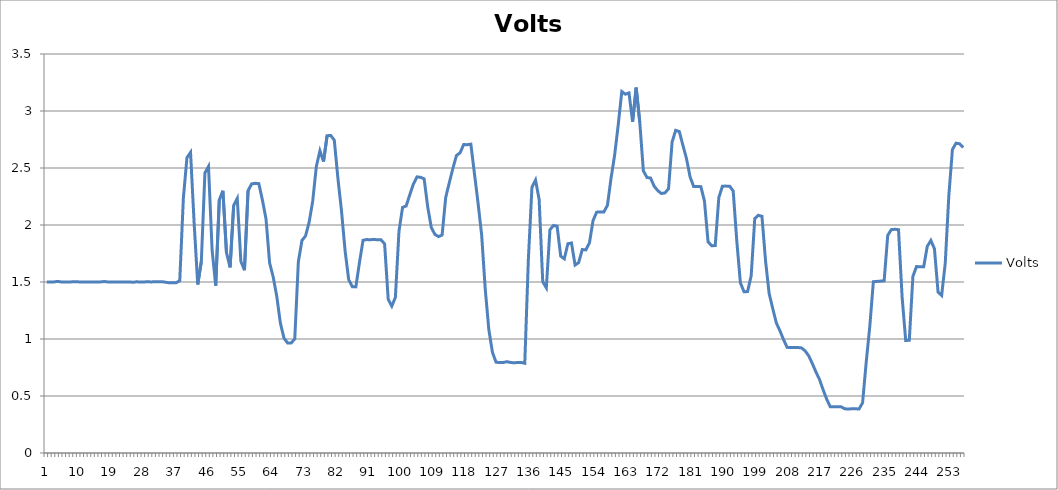
| Category | Volts |
|---|---|
| 0 | 1.501 |
| 1 | 1.5 |
| 2 | 1.501 |
| 3 | 1.505 |
| 4 | 1.501 |
| 5 | 1.5 |
| 6 | 1.501 |
| 7 | 1.501 |
| 8 | 1.502 |
| 9 | 1.501 |
| 10 | 1.5 |
| 11 | 1.501 |
| 12 | 1.501 |
| 13 | 1.5 |
| 14 | 1.501 |
| 15 | 1.501 |
| 16 | 1.504 |
| 17 | 1.501 |
| 18 | 1.5 |
| 19 | 1.501 |
| 20 | 1.5 |
| 21 | 1.501 |
| 22 | 1.501 |
| 23 | 1.501 |
| 24 | 1.498 |
| 25 | 1.502 |
| 26 | 1.5 |
| 27 | 1.501 |
| 28 | 1.502 |
| 29 | 1.501 |
| 30 | 1.502 |
| 31 | 1.503 |
| 32 | 1.503 |
| 33 | 1.498 |
| 34 | 1.493 |
| 35 | 1.494 |
| 36 | 1.493 |
| 37 | 1.512 |
| 38 | 2.235 |
| 39 | 2.591 |
| 40 | 2.637 |
| 41 | 2.016 |
| 42 | 1.478 |
| 43 | 1.68 |
| 44 | 2.456 |
| 45 | 2.514 |
| 46 | 1.778 |
| 47 | 1.469 |
| 48 | 2.22 |
| 49 | 2.301 |
| 50 | 1.757 |
| 51 | 1.628 |
| 52 | 2.171 |
| 53 | 2.233 |
| 54 | 1.682 |
| 55 | 1.603 |
| 56 | 2.3 |
| 57 | 2.36 |
| 58 | 2.365 |
| 59 | 2.363 |
| 60 | 2.218 |
| 61 | 2.054 |
| 62 | 1.667 |
| 63 | 1.544 |
| 64 | 1.373 |
| 65 | 1.139 |
| 66 | 1.008 |
| 67 | 0.965 |
| 68 | 0.965 |
| 69 | 1 |
| 70 | 1.678 |
| 71 | 1.864 |
| 72 | 1.905 |
| 73 | 2.024 |
| 74 | 2.211 |
| 75 | 2.513 |
| 76 | 2.651 |
| 77 | 2.556 |
| 78 | 2.783 |
| 79 | 2.786 |
| 80 | 2.744 |
| 81 | 2.411 |
| 82 | 2.125 |
| 83 | 1.775 |
| 84 | 1.521 |
| 85 | 1.459 |
| 86 | 1.457 |
| 87 | 1.67 |
| 88 | 1.866 |
| 89 | 1.872 |
| 90 | 1.871 |
| 91 | 1.874 |
| 92 | 1.87 |
| 93 | 1.87 |
| 94 | 1.834 |
| 95 | 1.348 |
| 96 | 1.288 |
| 97 | 1.366 |
| 98 | 1.947 |
| 99 | 2.155 |
| 100 | 2.167 |
| 101 | 2.265 |
| 102 | 2.358 |
| 103 | 2.422 |
| 104 | 2.418 |
| 105 | 2.405 |
| 106 | 2.157 |
| 107 | 1.976 |
| 108 | 1.917 |
| 109 | 1.898 |
| 110 | 1.912 |
| 111 | 2.242 |
| 112 | 2.372 |
| 113 | 2.497 |
| 114 | 2.61 |
| 115 | 2.633 |
| 116 | 2.706 |
| 117 | 2.704 |
| 118 | 2.709 |
| 119 | 2.451 |
| 120 | 2.193 |
| 121 | 1.914 |
| 122 | 1.438 |
| 123 | 1.082 |
| 124 | 0.884 |
| 125 | 0.797 |
| 126 | 0.793 |
| 127 | 0.794 |
| 128 | 0.801 |
| 129 | 0.795 |
| 130 | 0.791 |
| 131 | 0.794 |
| 132 | 0.794 |
| 133 | 0.787 |
| 134 | 1.697 |
| 135 | 2.331 |
| 136 | 2.394 |
| 137 | 2.223 |
| 138 | 1.503 |
| 139 | 1.449 |
| 140 | 1.958 |
| 141 | 1.996 |
| 142 | 1.989 |
| 143 | 1.727 |
| 144 | 1.703 |
| 145 | 1.836 |
| 146 | 1.842 |
| 147 | 1.649 |
| 148 | 1.67 |
| 149 | 1.784 |
| 150 | 1.782 |
| 151 | 1.843 |
| 152 | 2.039 |
| 153 | 2.113 |
| 154 | 2.115 |
| 155 | 2.114 |
| 156 | 2.172 |
| 157 | 2.409 |
| 158 | 2.612 |
| 159 | 2.878 |
| 160 | 3.171 |
| 161 | 3.147 |
| 162 | 3.159 |
| 163 | 2.905 |
| 164 | 3.205 |
| 165 | 2.903 |
| 166 | 2.475 |
| 167 | 2.417 |
| 168 | 2.412 |
| 169 | 2.341 |
| 170 | 2.302 |
| 171 | 2.276 |
| 172 | 2.281 |
| 173 | 2.318 |
| 174 | 2.728 |
| 175 | 2.83 |
| 176 | 2.82 |
| 177 | 2.7 |
| 178 | 2.583 |
| 179 | 2.422 |
| 180 | 2.337 |
| 181 | 2.339 |
| 182 | 2.336 |
| 183 | 2.21 |
| 184 | 1.853 |
| 185 | 1.818 |
| 186 | 1.82 |
| 187 | 2.241 |
| 188 | 2.341 |
| 189 | 2.341 |
| 190 | 2.341 |
| 191 | 2.298 |
| 192 | 1.859 |
| 193 | 1.493 |
| 194 | 1.415 |
| 195 | 1.416 |
| 196 | 1.555 |
| 197 | 2.057 |
| 198 | 2.085 |
| 199 | 2.076 |
| 200 | 1.686 |
| 201 | 1.399 |
| 202 | 1.267 |
| 203 | 1.141 |
| 204 | 1.072 |
| 205 | 0.995 |
| 206 | 0.927 |
| 207 | 0.924 |
| 208 | 0.925 |
| 209 | 0.925 |
| 210 | 0.922 |
| 211 | 0.896 |
| 212 | 0.853 |
| 213 | 0.786 |
| 214 | 0.712 |
| 215 | 0.646 |
| 216 | 0.557 |
| 217 | 0.473 |
| 218 | 0.406 |
| 219 | 0.405 |
| 220 | 0.406 |
| 221 | 0.406 |
| 222 | 0.388 |
| 223 | 0.385 |
| 224 | 0.388 |
| 225 | 0.388 |
| 226 | 0.386 |
| 227 | 0.44 |
| 228 | 0.793 |
| 229 | 1.108 |
| 230 | 1.503 |
| 231 | 1.505 |
| 232 | 1.508 |
| 233 | 1.51 |
| 234 | 1.91 |
| 235 | 1.96 |
| 236 | 1.962 |
| 237 | 1.959 |
| 238 | 1.367 |
| 239 | 0.987 |
| 240 | 0.989 |
| 241 | 1.549 |
| 242 | 1.636 |
| 243 | 1.633 |
| 244 | 1.634 |
| 245 | 1.813 |
| 246 | 1.864 |
| 247 | 1.791 |
| 248 | 1.412 |
| 249 | 1.382 |
| 250 | 1.663 |
| 251 | 2.256 |
| 252 | 2.662 |
| 253 | 2.717 |
| 254 | 2.713 |
| 255 | 2.679 |